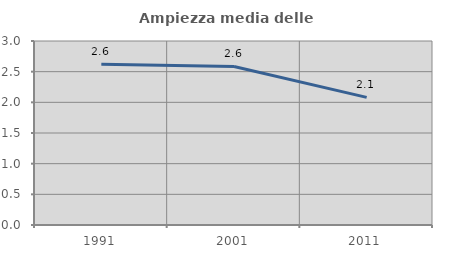
| Category | Ampiezza media delle famiglie |
|---|---|
| 1991.0 | 2.62 |
| 2001.0 | 2.584 |
| 2011.0 | 2.081 |